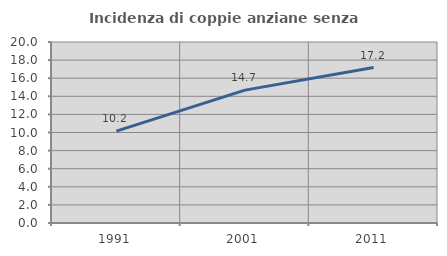
| Category | Incidenza di coppie anziane senza figli  |
|---|---|
| 1991.0 | 10.152 |
| 2001.0 | 14.685 |
| 2011.0 | 17.175 |